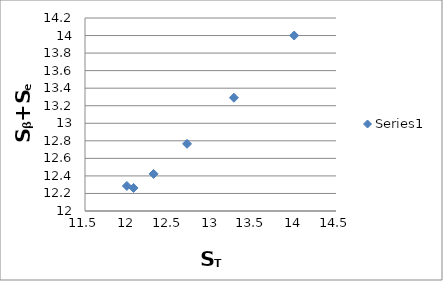
| Category | Series 0 |
|---|---|
| 14.0 | 14 |
| 13.279999999999998 | 13.291 |
| 12.72 | 12.766 |
| 12.32 | 12.423 |
| 12.080000000000002 | 12.263 |
| 12.0 | 12.286 |